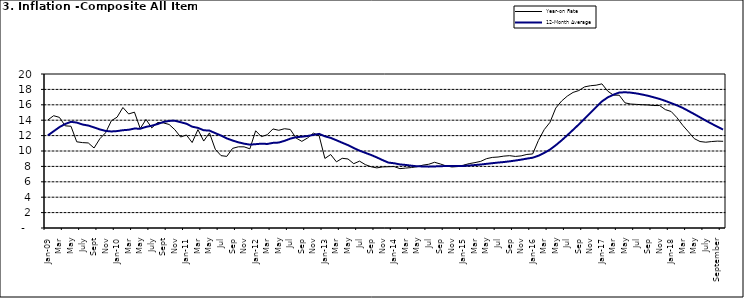
| Category | Year-on Rate | 12-Month Average |
|---|---|---|
| Jan-09 | 14.034 | 12.032 |
| Feb | 14.584 | 12.567 |
| Mar | 14.366 | 13.101 |
| Apr | 13.268 | 13.51 |
| May | 13.212 | 13.787 |
| June | 11.194 | 13.694 |
| July | 11.09 | 13.437 |
| Aug | 11.046 | 13.307 |
| Sept | 10.39 | 13.065 |
| Oct | 11.588 | 12.803 |
| Nov | 12.368 | 12.609 |
| Dec | 13.93 | 12.538 |
| Jan-10 | 14.398 | 12.586 |
| Feb | 15.649 | 12.7 |
| Mar | 14.812 | 12.757 |
| Apr | 15.044 | 12.915 |
| May | 12.915 | 12.893 |
| June | 14.099 | 13.132 |
| July | 13.002 | 13.284 |
| Aug | 13.702 | 13.5 |
| Sept | 13.65 | 13.764 |
| Oct | 13.45 | 13.908 |
| Nov | 12.766 | 13.928 |
| Dec | 11.815 | 13.74 |
| Jan-11 | 12.08 | 13.542 |
| Feb | 11.1 | 13.161 |
| Mar | 12.779 | 13.001 |
| Apr | 11.291 | 12.694 |
| May | 12.352 | 12.648 |
| Jun | 10.23 | 12.321 |
| Jul | 9.397 | 12.009 |
| Aug | 9.301 | 11.635 |
| Sep | 10.339 | 11.363 |
| Oct | 10.544 | 11.13 |
| Nov | 10.54 | 10.952 |
| Dec | 10.283 | 10.826 |
| Jan-12 | 12.626 | 10.886 |
| Feb | 11.866 | 10.955 |
| Mar | 12.111 | 10.914 |
| Apr | 12.866 | 11.054 |
| May | 12.688 | 11.096 |
| Jun | 12.892 | 11.32 |
| Jul | 12.797 | 11.599 |
| Aug | 11.689 | 11.791 |
| Sep | 11.253 | 11.859 |
| Oct | 11.693 | 11.948 |
| Nov | 12.32 | 12.091 |
| Dec | 11.981 | 12.224 |
| Jan-13 | 9.031 | 11.908 |
| Feb | 9.542 | 11.703 |
| Mar | 8.593 | 11.394 |
| Apr | 9.052 | 11.072 |
| May | 8.964 | 10.761 |
| Jun | 8.353 | 10.383 |
| Jul | 8.682 | 10.047 |
| Aug | 8.231 | 9.761 |
| Sep | 7.952 | 9.486 |
| Oct | 7.807 | 9.167 |
| Nov | 7.931 | 8.815 |
| Dec | 7.957 | 8.496 |
| Jan-14 | 7.977 | 8.408 |
| Feb | 7.707 | 8.257 |
| Mar | 7.783 | 8.19 |
| Apr | 7.851 | 8.092 |
| May | 7.965 | 8.012 |
| Jun | 8.167 | 7.998 |
| Jul | 8.281 | 7.968 |
| Aug | 8.534 | 7.996 |
| Sep | 8.317 | 8.027 |
| Oct | 8.06 | 8.047 |
| Nov | 7.927 | 8.046 |
| Dec | 7.978 | 8.047 |
| Jan-15 | 8.157 | 8.063 |
| Feb | 8.359 | 8.117 |
| Mar | 8.494 | 8.176 |
| Apr | 8.655 | 8.243 |
| May | 9.003 | 8.331 |
| Jun | 9.168 | 8.417 |
| Jul | 9.218 | 8.497 |
| Aug | 9.336 | 8.566 |
| Sep | 9.394 | 8.658 |
| Oct | 9.296 | 8.76 |
| Nov | 9.368 | 8.879 |
| Dec | 9.554 | 9.009 |
| Jan-16 | 9.617 | 9.13 |
| Feb | 11.379 | 9.386 |
| Mar | 12.775 | 9.751 |
| Apr | 13.721 | 10.182 |
| May | 15.577 | 10.746 |
| Jun | 16.48 | 11.372 |
| Jul | 17.127 | 12.045 |
| Aug | 17.609 | 12.744 |
| Sep | 17.852 | 13.454 |
| Oct | 18.33 | 14.206 |
| Nov | 18.476 | 14.958 |
| Dec | 18.547 | 15.697 |
| Jan-17 | 18.719 | 16.441 |
| Feb | 17.78 | 16.958 |
| Mar | 17.256 | 17.315 |
| Apr | 17.244 | 17.591 |
| May | 16.251 | 17.628 |
| Jun | 16.098 | 17.578 |
| Jul | 16.053 | 17.475 |
| Aug | 16.012 | 17.331 |
| Sep | 15.979 | 17.17 |
| Oct | 15.905 | 16.968 |
| Nov | 15.901 | 16.76 |
| Dec | 15.372 | 16.502 |
| Jan-18 | 15.127 | 16.215 |
| Feb | 14.33 | 15.93 |
| Mar | 13.337 | 15.599 |
| Apr | 12.482 | 15.196 |
| May | 11.608 | 14.793 |
| June | 11.231 | 14.371 |
| July | 11.142 | 13.95 |
| August | 11.227 | 13.546 |
| September | 11.284 | 13.157 |
| October | 11.259 | 12.777 |